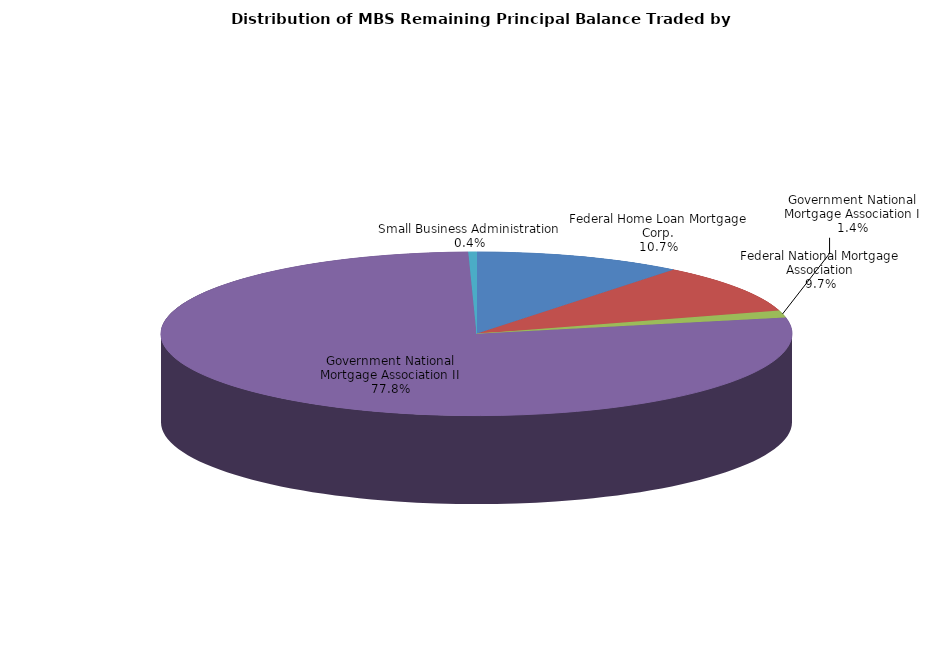
| Category | Series 0 |
|---|---|
| Federal Home Loan Mortgage Corp. | 989053483.01 |
| Federal National Mortgage Association | 893466262.458 |
| Government National Mortgage Association I | 128735976.001 |
| Government National Mortgage Association II | 7177630360.364 |
| Small Business Administration | 38521821.346 |